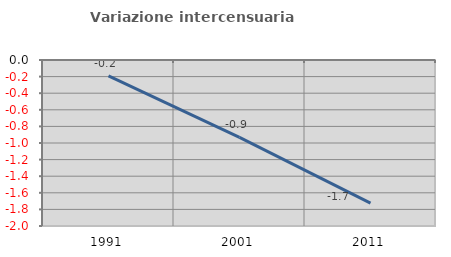
| Category | Variazione intercensuaria annua |
|---|---|
| 1991.0 | -0.19 |
| 2001.0 | -0.933 |
| 2011.0 | -1.724 |